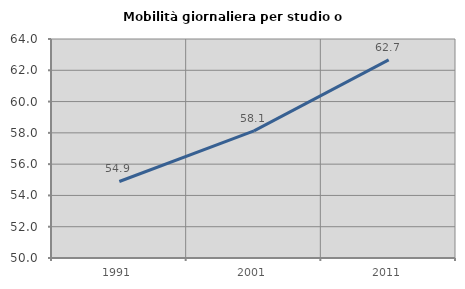
| Category | Mobilità giornaliera per studio o lavoro |
|---|---|
| 1991.0 | 54.892 |
| 2001.0 | 58.124 |
| 2011.0 | 62.669 |